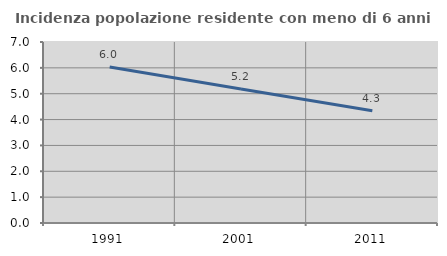
| Category | Incidenza popolazione residente con meno di 6 anni |
|---|---|
| 1991.0 | 6.033 |
| 2001.0 | 5.183 |
| 2011.0 | 4.342 |